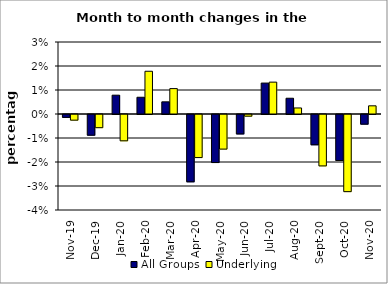
| Category | All Groups | Underlying |
|---|---|---|
| 2019-11-01 | -0.001 | -0.002 |
| 2019-12-01 | -0.009 | -0.005 |
| 2020-01-01 | 0.008 | -0.011 |
| 2020-02-01 | 0.007 | 0.018 |
| 2020-03-01 | 0.005 | 0.011 |
| 2020-04-01 | -0.028 | -0.018 |
| 2020-05-01 | -0.02 | -0.014 |
| 2020-06-01 | -0.008 | -0.001 |
| 2020-07-01 | 0.013 | 0.013 |
| 2020-08-01 | 0.007 | 0.003 |
| 2020-09-01 | -0.013 | -0.021 |
| 2020-10-01 | -0.019 | -0.032 |
| 2020-11-01 | -0.004 | 0.003 |